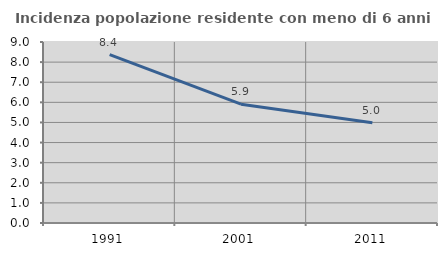
| Category | Incidenza popolazione residente con meno di 6 anni |
|---|---|
| 1991.0 | 8.372 |
| 2001.0 | 5.908 |
| 2011.0 | 4.98 |